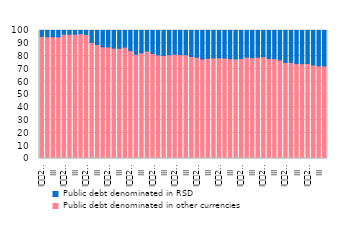
| Category | Public debt denominated in other currencies | Public debt denominated in RSD  |
|---|---|---|
| I
2007 | 95.4 | 4.6 |
| II | 95.1 | 4.9 |
| III | 95.1 | 4.9 |
| IV | 95.1 | 4.9 |
| I
2008 | 97.1 | 2.9 |
| II | 97.1 | 2.9 |
| III | 97.1 | 2.9 |
| IV | 97.5 | 2.5 |
| I
2009 | 96.9 | 3.1 |
| II | 90.7 | 9.3 |
| III | 89.1 | 10.9 |
| IV | 87.2 | 12.8 |
| I
2010 | 87.1 | 12.9 |
| II | 86.2 | 13.8 |
| III | 86.1 | 13.9 |
| IV | 87 | 13 |
| I
2011 | 84.2 | 15.8 |
| II | 81.5 | 18.5 |
| III | 82.6 | 17.4 |
| IV | 83.9 | 16.1 |
| I
2012 | 82 | 18 |
| II | 80.9 | 19.1 |
| III | 80.5 | 19.5 |
| IV | 81.1 | 18.9 |
| I
2013 | 81.5 | 18.5 |
| II | 81.2 | 18.8 |
| III | 81.1 | 18.9 |
| IV | 79.7 | 20.3 |
| I
2014 | 79.1 | 20.9 |
| II | 77.7 | 22.3 |
| III | 78.3 | 21.7 |
| IV | 78.6 | 21.4 |
| I
2015 | 78.6 | 21.4 |
| II | 78.5 | 21.5 |
| III | 78 | 22 |
| IV | 77.8 | 22.2 |
| I
2016 | 78.138 | 21.862 |
| II | 79.184 | 20.816 |
| III | 78.654 | 21.346 |
| IV | 79.122 | 20.877 |
| I
2017 | 79.5 | 20.5 |
| II | 78.1 | 21.9 |
| III | 78 | 22 |
| IV | 77 | 23 |
| I
2018 | 75 | 25 |
| II | 75.1 | 24.9 |
| III | 74.1 | 25.9 |
| IV | 74 | 26 |
| I
2019 | 74.188 | 25.812 |
| II | 73.033 | 26.967 |
| III | 72.361 | 27.639 |
| IV | 72.253 | 27.747 |